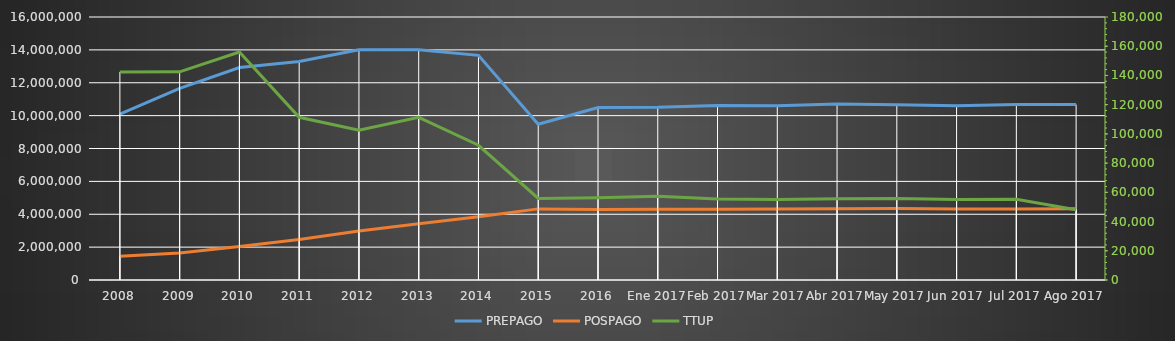
| Category | PREPAGO | POSPAGO |
|---|---|---|
| 2008 | 10097768 | 1452088 |
| 2009 | 11662294 | 1649838 |
| 2010 | 12929040 | 2033814 |
| 2011 | 13295834 | 2467378 |
| 2012 | 14008104 | 2976194 |
| 2013 | 14005126 | 3425277 |
| 2014 | 13666071 | 3846271 |
| 2015 | 9476240 | 4326937 |
| 2016 | 10498467 | 4293426 |
| Ene 2017 | 10505977.213 | 4309960.718 |
| Feb 2017 | 10611370 | 4302713 |
| Mar 2017 | 10593764 | 4322282 |
| Abr 2017 | 10714352 | 4334579 |
| May 2017 | 10656096 | 4350004 |
| Jun 2017 | 10602467 | 4319267 |
| Jul 2017 | 10677465 | 4322549 |
| Ago 2017 | 10670968 | 4330911 |